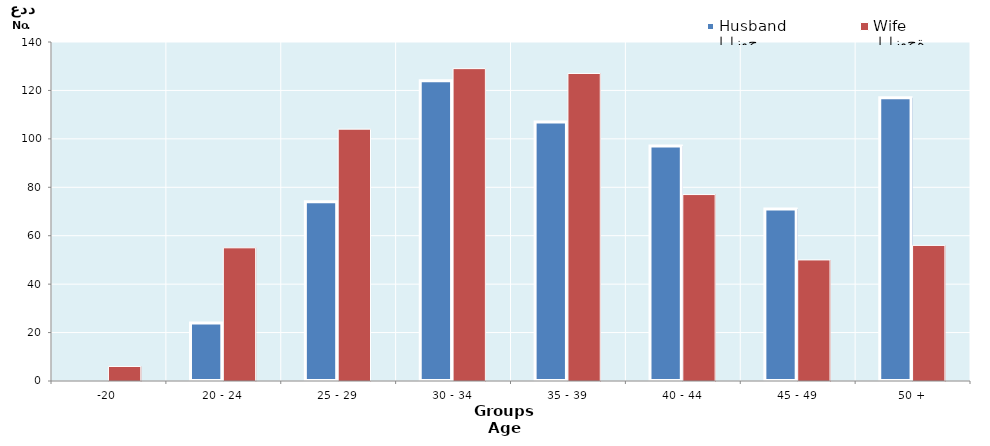
| Category | الزوج
Husband |  الزوجة
Wife |
|---|---|---|
| -20 | 0 | 6 |
| 20 - 24 | 24 | 55 |
| 25 - 29 | 74 | 104 |
| 30 - 34 | 124 | 129 |
| 35 - 39 | 107 | 127 |
| 40 - 44 | 97 | 77 |
| 45 - 49 | 71 | 50 |
| 50 + | 117 | 56 |